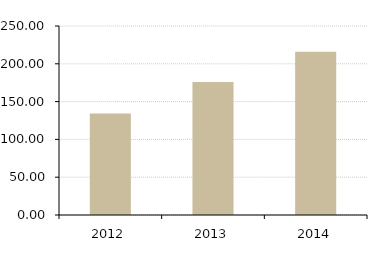
| Category | Current Ratio |
|---|---|
| 2012.0 | 134.242 |
| 2013.0 | 176.004 |
| 2014.0 | 215.778 |